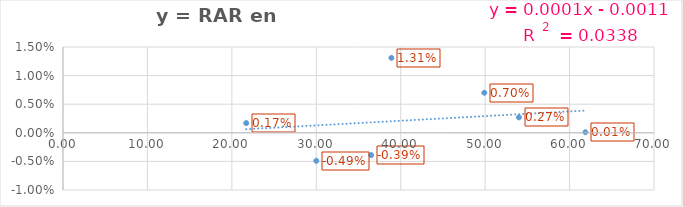
| Category | y = RAR en MortCV |
|---|---|
| 38.9 | 0.013 |
| 54.0 | 0.003 |
| 61.8716163959784 | 0 |
| 21.7 | 0.002 |
| 36.5 | -0.004 |
| 30.0 | -0.005 |
| 49.9 | 0.007 |